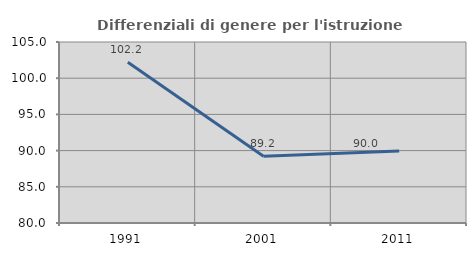
| Category | Differenziali di genere per l'istruzione superiore |
|---|---|
| 1991.0 | 102.191 |
| 2001.0 | 89.207 |
| 2011.0 | 89.957 |